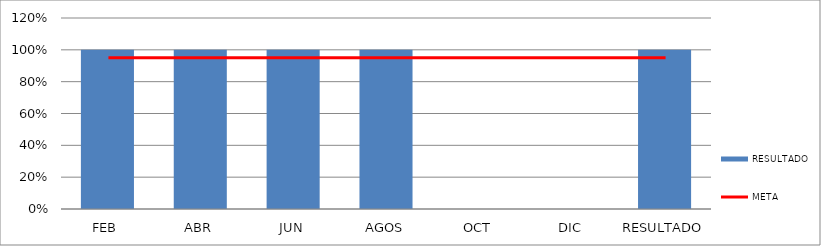
| Category | RESULTADO |
|---|---|
| FEB | 1 |
| ABR | 1 |
| JUN | 1 |
| AGOS | 1 |
| OCT | 0 |
| DIC | 0 |
| RESULTADO | 1 |